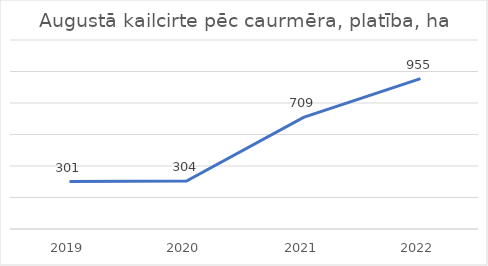
| Category | Augustā kailcirte pēc caurmēra, platība, ha |
|---|---|
| 2019.0 | 301 |
| 2020.0 | 304 |
| 2021.0 | 709 |
| 2022.0 | 955 |